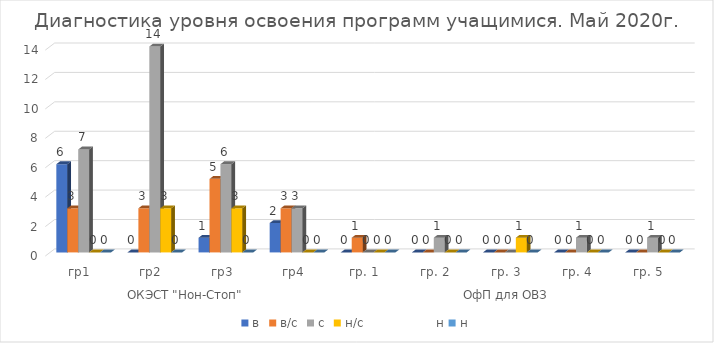
| Category | в | в/с | с | н/с                  н | н |
|---|---|---|---|---|---|
| 0 | 6 | 3 | 7 | 0 | 0 |
| 1 | 0 | 3 | 14 | 3 | 0 |
| 2 | 1 | 5 | 6 | 3 | 0 |
| 3 | 2 | 3 | 3 | 0 | 0 |
| 4 | 0 | 1 | 0 | 0 | 0 |
| 5 | 0 | 0 | 1 | 0 | 0 |
| 6 | 0 | 0 | 0 | 1 | 0 |
| 7 | 0 | 0 | 1 | 0 | 0 |
| 8 | 0 | 0 | 1 | 0 | 0 |